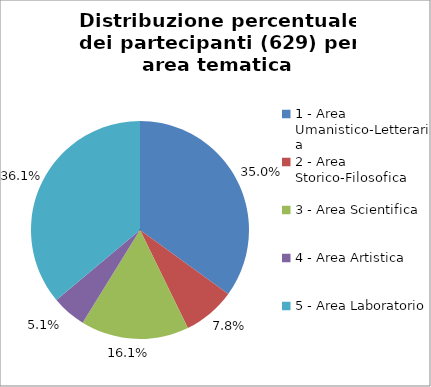
| Category | Nr. Partecipanti |
|---|---|
| 1 - Area Umanistico-Letteraria | 220 |
| 2 - Area Storico-Filosofica | 49 |
| 3 - Area Scientifica | 101 |
| 4 - Area Artistica | 32 |
| 5 - Area Laboratorio | 227 |